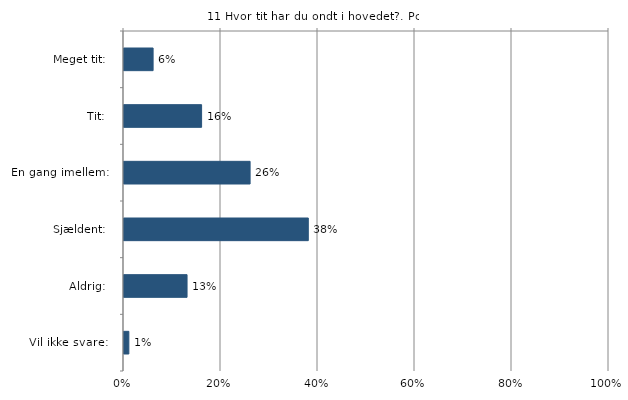
| Category | Hvor tit har du ondt i hovedet? |
|---|---|
| Meget tit:   | 0.06 |
| Tit:   | 0.16 |
| En gang imellem:   | 0.26 |
| Sjældent:   | 0.38 |
| Aldrig:   | 0.13 |
| Vil ikke svare:   | 0.01 |